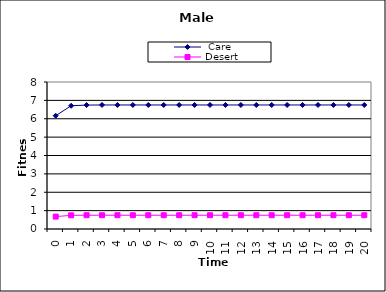
| Category |  Care | Desert |
|---|---|---|
| 0.0 | 6.165 | 0.675 |
| 1.0 | 6.707 | 0.744 |
| 2.0 | 6.745 | 0.749 |
| 3.0 | 6.749 | 0.75 |
| 4.0 | 6.75 | 0.75 |
| 5.0 | 6.75 | 0.75 |
| 6.0 | 6.75 | 0.75 |
| 7.0 | 6.75 | 0.75 |
| 8.0 | 6.75 | 0.75 |
| 9.0 | 6.75 | 0.75 |
| 10.0 | 6.75 | 0.75 |
| 11.0 | 6.75 | 0.75 |
| 12.0 | 6.75 | 0.75 |
| 13.0 | 6.75 | 0.75 |
| 14.0 | 6.75 | 0.75 |
| 15.0 | 6.75 | 0.75 |
| 16.0 | 6.75 | 0.75 |
| 17.0 | 6.75 | 0.75 |
| 18.0 | 6.75 | 0.75 |
| 19.0 | 6.75 | 0.75 |
| 20.0 | 6.75 | 0.75 |